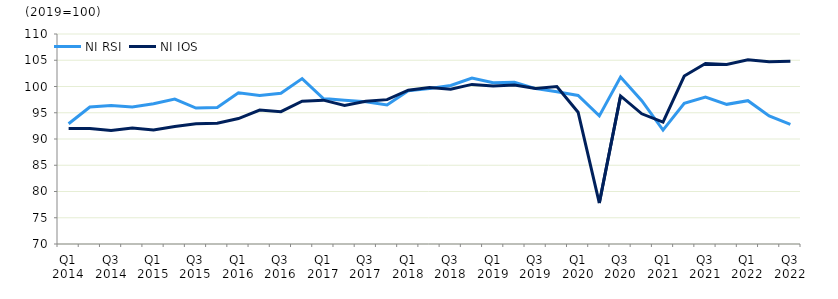
| Category | NI RSI | NI IOS |
|---|---|---|
| Q1 2014 | 92.9 | 92 |
|  | 96.1 | 92 |
| Q3 2014 | 96.4 | 91.6 |
|  | 96.1 | 92.1 |
| Q1 2015 | 96.7 | 91.7 |
|  | 97.6 | 92.4 |
| Q3 2015 | 95.9 | 92.9 |
|  | 96 | 93 |
| Q1 2016 | 98.8 | 93.9 |
|  | 98.3 | 95.5 |
| Q3 2016 | 98.7 | 95.2 |
|  | 101.5 | 97.2 |
| Q1 2017 | 97.7 | 97.4 |
|  | 97.4 | 96.4 |
| Q3 2017 | 97.1 | 97.2 |
|  | 96.5 | 97.5 |
| Q1 2018 | 99.2 | 99.3 |
|  | 99.6 | 99.8 |
| Q3 2018 | 100.2 | 99.5 |
|  | 101.6 | 100.4 |
| Q1 2019 | 100.7 | 100.1 |
|  | 100.8 | 100.3 |
| Q3 2019 | 99.6 | 99.6 |
|  | 99 | 100 |
| Q1 2020 | 98.3 | 95.1 |
|  | 94.4 | 77.8 |
| Q3 2020 | 101.8 | 98.2 |
|  | 97.3 | 94.8 |
| Q1 2021 | 91.7 | 93.2 |
|  | 96.8 | 102 |
| Q3 2021 | 98 | 104.4 |
|  | 96.6 | 104.2 |
| Q1 2022 | 97.3 | 105.1 |
|  | 94.4 | 104.7 |
| Q3 2022 | 92.8 | 104.8 |